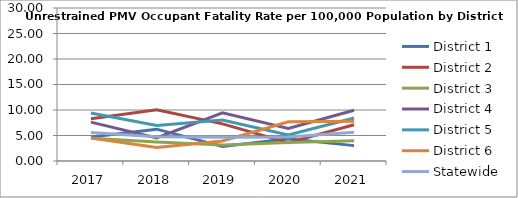
| Category | District 1 | District 2 | District 3 | District 4 | District 5 | District 6 | Statewide |
|---|---|---|---|---|---|---|---|
| 2017.0 | 4.684 | 8.293 | 4.459 | 7.625 | 9.42 | 4.501 | 5.591 |
| 2018.0 | 6.245 | 10.03 | 3.719 | 4.521 | 6.958 | 2.654 | 4.731 |
| 2019.0 | 2.847 | 7.288 | 3.146 | 9.451 | 8.047 | 3.915 | 4.644 |
| 2020.0 | 4.357 | 3.601 | 3.651 | 6.372 | 5.124 | 7.674 | 4.707 |
| 2021.0 | 3.014 | 7.116 | 3.985 | 9.953 | 8.426 | 7.815 | 5.629 |